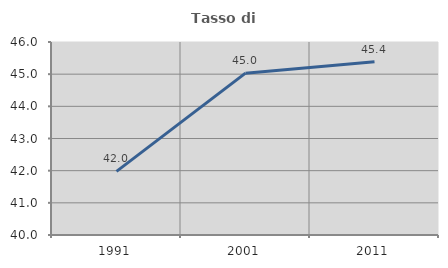
| Category | Tasso di occupazione   |
|---|---|
| 1991.0 | 41.978 |
| 2001.0 | 45.031 |
| 2011.0 | 45.385 |